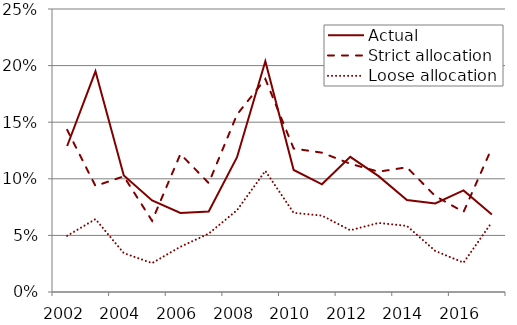
| Category | Actual | Strict allocation | Loose allocation |
|---|---|---|---|
| 2002.0 | 0.129 | 0.143 | 0.05 |
| 2003.0 | 0.195 | 0.094 | 0.064 |
| 2004.0 | 0.103 | 0.102 | 0.034 |
| 2005.0 | 0.081 | 0.063 | 0.026 |
| 2006.0 | 0.07 | 0.122 | 0.04 |
| 2007.0 | 0.071 | 0.096 | 0.052 |
| 2008.0 | 0.119 | 0.157 | 0.072 |
| 2009.0 | 0.204 | 0.188 | 0.107 |
| 2010.0 | 0.108 | 0.127 | 0.07 |
| 2011.0 | 0.095 | 0.123 | 0.067 |
| 2012.0 | 0.119 | 0.113 | 0.055 |
| 2013.0 | 0.102 | 0.106 | 0.061 |
| 2014.0 | 0.081 | 0.11 | 0.058 |
| 2015.0 | 0.078 | 0.085 | 0.036 |
| 2016.0 | 0.09 | 0.071 | 0.026 |
| 2017.0 | 0.068 | 0.127 | 0.062 |